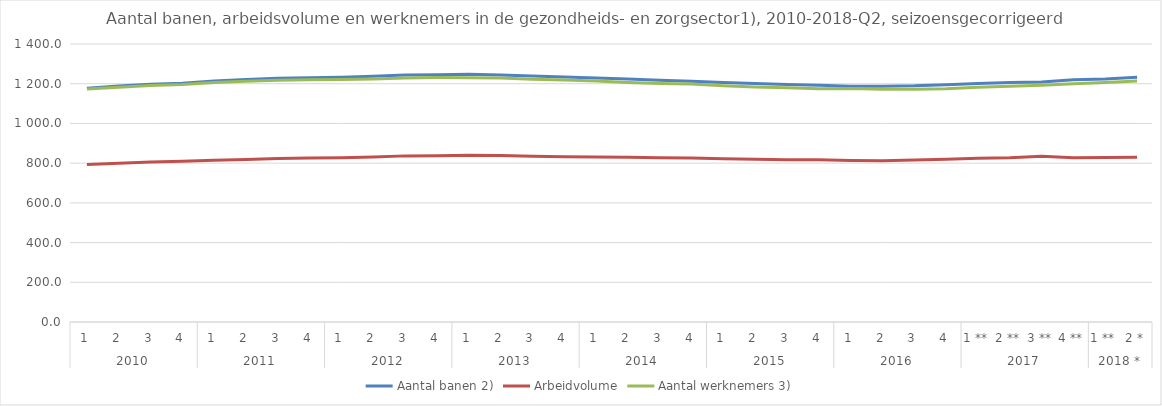
| Category | Aantal banen 2) | Arbeidvolume | Aantal werknemers 3) |
|---|---|---|---|
| 0 | 1176.6 | 792.6 | 1174 |
| 1 | 1188.4 | 799.7 | 1182 |
| 2 | 1197.6 | 805.2 | 1190.6 |
| 3 | 1201.8 | 809 | 1195.8 |
| 4 | 1214 | 814.1 | 1205.6 |
| 5 | 1221.3 | 818.1 | 1212.5 |
| 6 | 1227.7 | 823.7 | 1217.9 |
| 7 | 1230.5 | 826.2 | 1220.2 |
| 8 | 1233.1 | 827.5 | 1221.3 |
| 9 | 1237.7 | 830.6 | 1223.7 |
| 10 | 1244.2 | 836.6 | 1229.1 |
| 11 | 1245.6 | 836.8 | 1230.7 |
| 12 | 1247.2 | 839.9 | 1230.5 |
| 13 | 1243.4 | 838.4 | 1229.3 |
| 14 | 1238.5 | 834.7 | 1222.1 |
| 15 | 1234.3 | 832.8 | 1218.5 |
| 16 | 1228.7 | 830.8 | 1213.3 |
| 17 | 1223.8 | 829.5 | 1206.6 |
| 18 | 1217.9 | 827.3 | 1201.4 |
| 19 | 1212.1 | 825.7 | 1198.1 |
| 20 | 1206.3 | 822.3 | 1189.8 |
| 21 | 1200.5 | 819.3 | 1183.8 |
| 22 | 1196.1 | 817.2 | 1180.2 |
| 23 | 1191.8 | 816.8 | 1174.1 |
| 24 | 1187.4 | 813.4 | 1175.7 |
| 25 | 1187.3 | 812.5 | 1171.6 |
| 26 | 1189.2 | 815.2 | 1172.5 |
| 27 | 1194.9 | 819.8 | 1175.1 |
| 28 | 1201 | 825 | 1182.4 |
| 29 | 1206.2 | 827.4 | 1187.3 |
| 30 | 1209.1 | 834.5 | 1192.5 |
| 31 | 1219.4 | 827.4 | 1200.4 |
| 32 | 1224.3 | 828 | 1205.6 |
| 33 | 1233.1 | 830 | 1214 |